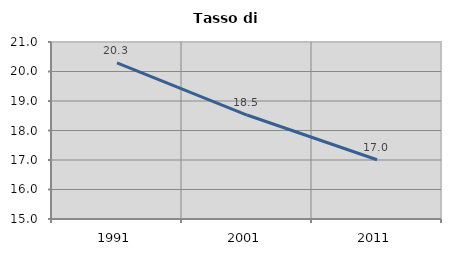
| Category | Tasso di disoccupazione   |
|---|---|
| 1991.0 | 20.29 |
| 2001.0 | 18.524 |
| 2011.0 | 17.009 |